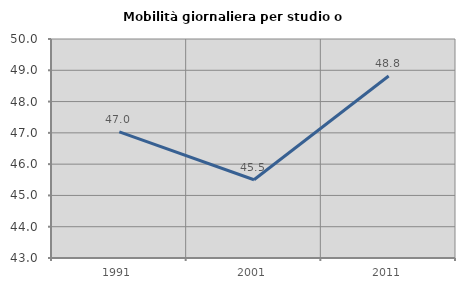
| Category | Mobilità giornaliera per studio o lavoro |
|---|---|
| 1991.0 | 47.031 |
| 2001.0 | 45.502 |
| 2011.0 | 48.819 |